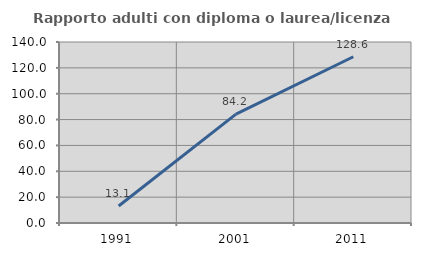
| Category | Rapporto adulti con diploma o laurea/licenza media  |
|---|---|
| 1991.0 | 13.115 |
| 2001.0 | 84.211 |
| 2011.0 | 128.571 |